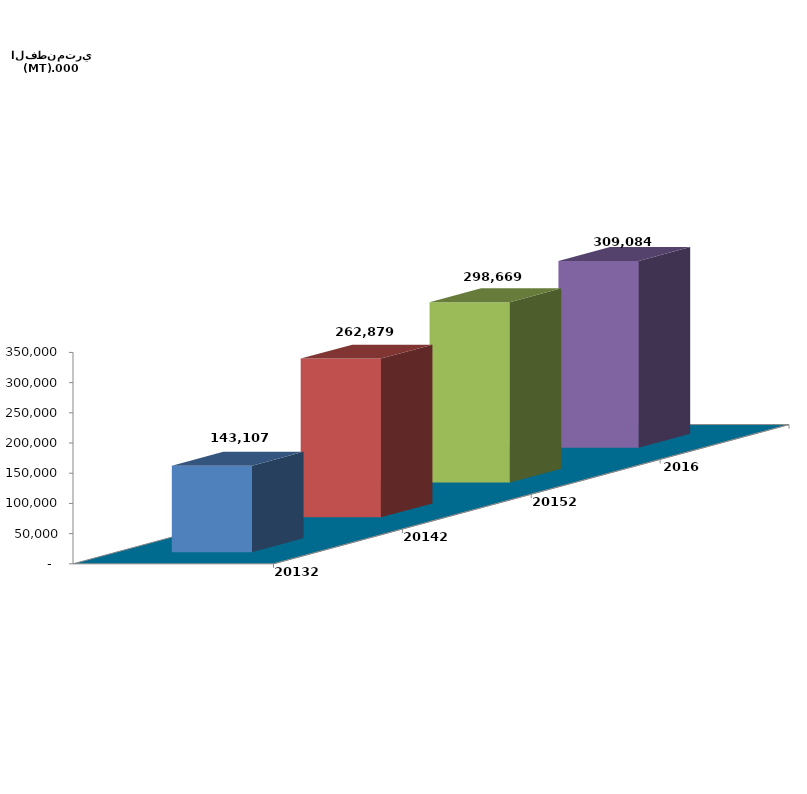
| Category | 20132 | 20142 | 20152 | 2016 |
|---|---|---|---|---|
| 0 | 143107 | 262879 | 298669 | 309084 |